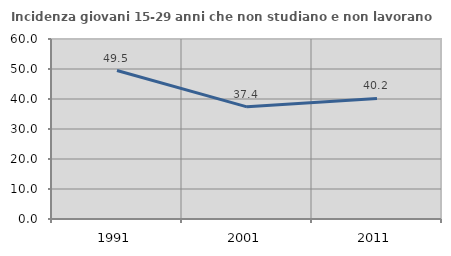
| Category | Incidenza giovani 15-29 anni che non studiano e non lavorano  |
|---|---|
| 1991.0 | 49.48 |
| 2001.0 | 37.391 |
| 2011.0 | 40.187 |